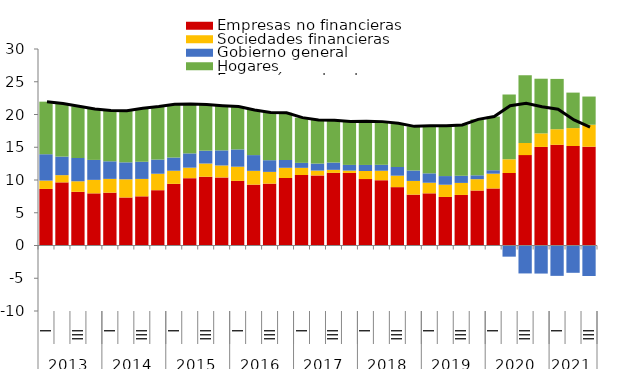
| Category | Empresas no financieras | Sociedades financieras | Gobierno general | Hogares |
|---|---|---|---|---|
| 0 | 8.633 | 1.281 | 4.021 | 8.026 |
| 1 | 9.639 | 1.102 | 2.834 | 8.088 |
| 2 | 8.194 | 1.612 | 3.551 | 7.899 |
| 3 | 7.962 | 2.059 | 3.046 | 7.77 |
| 4 | 8.063 | 2.107 | 2.684 | 7.756 |
| 5 | 7.331 | 2.777 | 2.588 | 7.868 |
| 6 | 7.507 | 2.657 | 2.621 | 8.166 |
| 7 | 8.443 | 2.511 | 2.166 | 8.096 |
| 8 | 9.412 | 2.003 | 2.018 | 8.13 |
| 9 | 10.285 | 1.601 | 2.176 | 7.561 |
| 10 | 10.497 | 2.02 | 1.96 | 7.047 |
| 11 | 10.397 | 1.821 | 2.305 | 6.827 |
| 12 | 9.869 | 2.163 | 2.637 | 6.551 |
| 13 | 9.293 | 2.106 | 2.403 | 6.9 |
| 14 | 9.447 | 1.792 | 1.783 | 7.282 |
| 15 | 10.307 | 1.558 | 1.188 | 7.209 |
| 16 | 10.766 | 1.091 | 0.759 | 6.906 |
| 17 | 10.702 | 0.736 | 1.069 | 6.661 |
| 18 | 11.096 | 0.455 | 1.112 | 6.447 |
| 19 | 11.076 | 0.36 | 0.868 | 6.614 |
| 20 | 10.139 | 1.239 | 0.92 | 6.69 |
| 21 | 9.966 | 1.446 | 0.906 | 6.594 |
| 22 | 8.91 | 1.75 | 1.321 | 6.669 |
| 23 | 7.767 | 2.093 | 1.588 | 6.741 |
| 24 | 7.966 | 1.616 | 1.434 | 7.276 |
| 25 | 7.411 | 1.868 | 1.321 | 7.668 |
| 26 | 7.719 | 1.837 | 1.089 | 7.754 |
| 27 | 8.393 | 1.733 | 0.59 | 8.537 |
| 28 | 8.708 | 2.258 | 0.528 | 8.193 |
| 29 | 11.072 | 2.09 | -1.704 | 9.883 |
| 30 | 13.8 | 1.855 | -4.266 | 10.32 |
| 31 | 15.05 | 2.068 | -4.285 | 8.346 |
| 32 | 15.377 | 2.374 | -4.636 | 7.684 |
| 33 | 15.189 | 2.737 | -4.168 | 5.417 |
| 34 | 15.082 | 3.355 | -4.66 | 4.305 |